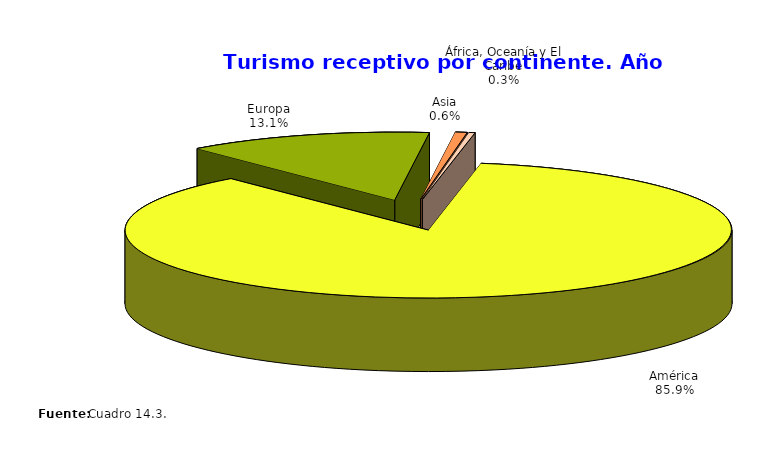
| Category | Series 0 |
|---|---|
| América | 81510 |
| Europa | 12435 |
| Asia | 597 |
| África, Oceanía y El Caribe | 304 |